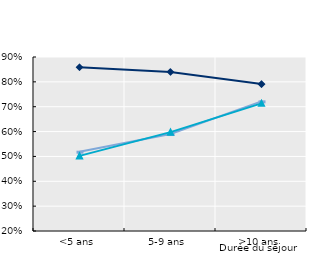
| Category | Travail | Series 4 | Famille | Series 5 | Humanitaire | Series 6 |
|---|---|---|---|---|---|---|
| <5 ans | 0.859 |  | 0.519 |  | 0.502 |  |
| 5-9 ans | 0.84 |  | 0.59 |  | 0.598 |  |
| >10 ans | 0.791 |  | 0.722 |  | 0.713 |  |